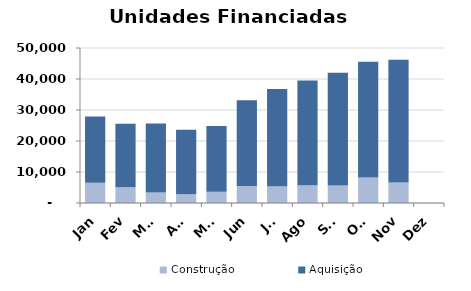
| Category | Construção | Aquisição  |
|---|---|---|
| Jan | 6521 | 21372 |
| Fev | 5079 | 20448 |
| Mar | 3354 | 22300 |
| Abr | 2813 | 20830 |
| Mai | 3650 | 21183 |
| Jun | 5496 | 27653 |
| Jul | 5439 | 31374 |
| Ago | 5744 | 33764 |
| Set | 5647 | 36388 |
| Out | 8218 | 37326 |
| Nov | 6593 | 39654 |
| Dez | 0 | 0 |